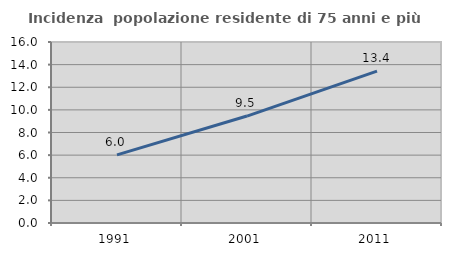
| Category | Incidenza  popolazione residente di 75 anni e più |
|---|---|
| 1991.0 | 6.026 |
| 2001.0 | 9.455 |
| 2011.0 | 13.43 |